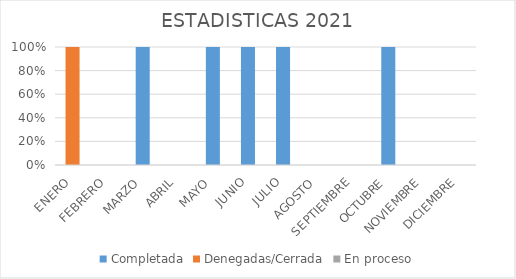
| Category | Completada | Denegadas/Cerrada | En proceso |
|---|---|---|---|
| ENERO | 0 | 1 | 0 |
| FEBRERO | 0 | 0 | 0 |
| MARZO | 1 | 0 | 0 |
| ABRIL | 0 | 0 | 0 |
| MAYO | 1 | 0 | 0 |
| JUNIO | 2 | 0 | 0 |
| JULIO | 1 | 0 | 0 |
| AGOSTO | 0 | 0 | 0 |
| SEPTIEMBRE | 0 | 0 | 0 |
| OCTUBRE | 1 | 0 | 0 |
| NOVIEMBRE | 0 | 0 | 0 |
| DICIEMBRE | 0 | 0 | 0 |